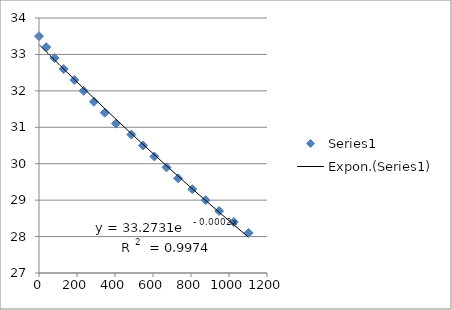
| Category | Series 0 |
|---|---|
| 0.0 | 33.5 |
| 38.0 | 33.2 |
| 82.0 | 32.9 |
| 130.0 | 32.6 |
| 186.0 | 32.3 |
| 235.0 | 32 |
| 289.0 | 31.7 |
| 346.0 | 31.4 |
| 405.0 | 31.1 |
| 486.0 | 30.8 |
| 547.0 | 30.5 |
| 607.0 | 30.2 |
| 671.0 | 29.9 |
| 732.0 | 29.6 |
| 807.0 | 29.3 |
| 877.0 | 29 |
| 948.0 | 28.7 |
| 1025.0 | 28.4 |
| 1103.0 | 28.1 |